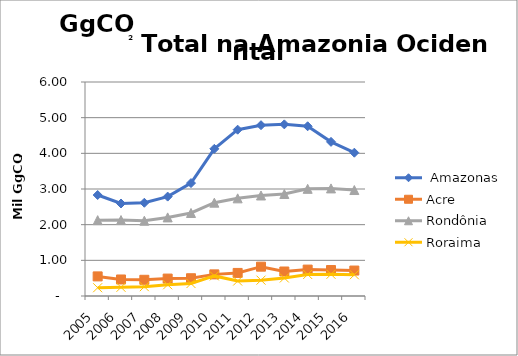
| Category |  Amazonas | Acre | Rondônia | Roraima |
|---|---|---|---|---|
| 2005.0 | 2831.087 | 549.746 | 2126.58 | 231.993 |
| 2006.0 | 2593.713 | 463.31 | 2129.155 | 244.012 |
| 2007.0 | 2614.358 | 454.648 | 2110.796 | 261.5 |
| 2008.0 | 2786.932 | 488.416 | 2203.564 | 314.838 |
| 2009.0 | 3165.768 | 497.779 | 2327.925 | 349.312 |
| 2010.0 | 4125.918 | 606.314 | 2616.4 | 563.207 |
| 2011.0 | 4663.276 | 646.919 | 2737.804 | 419.565 |
| 2012.0 | 4788.853 | 822.36 | 2818.489 | 444.331 |
| 2013.0 | 4811.954 | 686.878 | 2860.265 | 505.235 |
| 2014.0 | 4758.766 | 740.298 | 3004.747 | 603.771 |
| 2015.0 | 4321.921 | 727.96 | 3016.341 | 608.593 |
| 2016.0 | 4017.997 | 713.558 | 2971.24 | 595.549 |